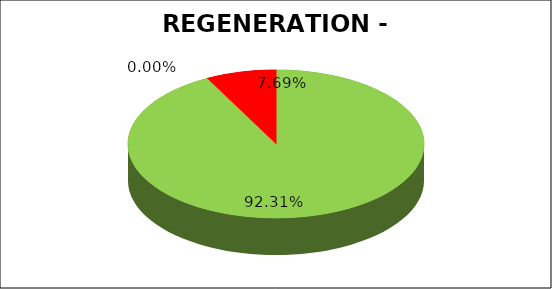
| Category | Series 0 |
|---|---|
| Green | 0.923 |
| Amber | 0 |
| Red | 0.077 |